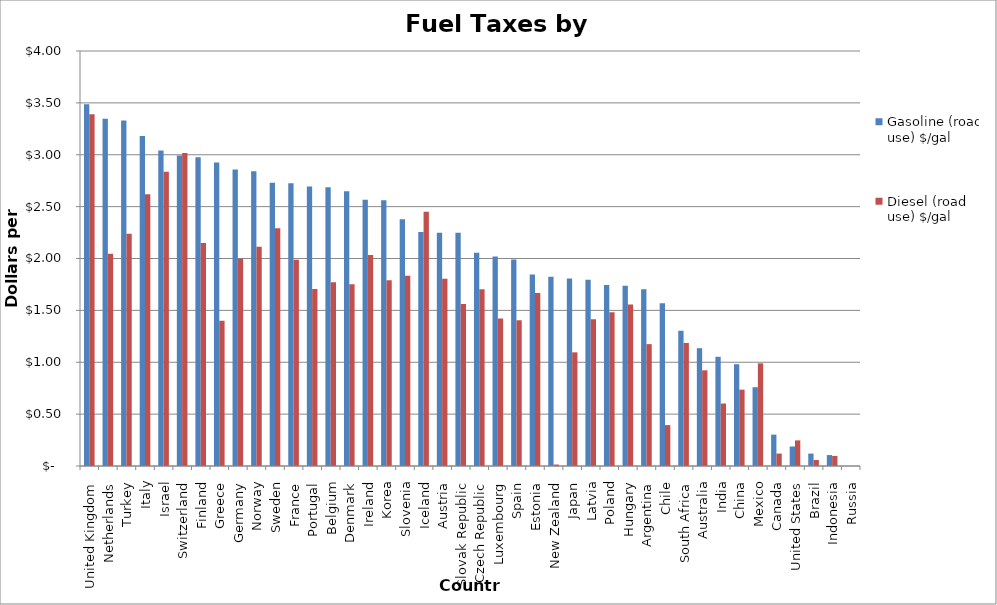
| Category | Gasoline (road use) $/gal | Diesel (road use) $/gal |
|---|---|---|
| United Kingdom | 3.487 | 3.389 |
| Netherlands | 3.346 | 2.047 |
| Turkey | 3.33 | 2.238 |
| Italy | 3.18 | 2.62 |
| Israel | 3.041 | 2.837 |
| Switzerland | 2.992 | 3.018 |
| Finland | 2.976 | 2.149 |
| Greece | 2.926 | 1.401 |
| Germany | 2.859 | 1.997 |
| Norway | 2.842 | 2.112 |
| Sweden | 2.731 | 2.292 |
| France | 2.726 | 1.988 |
| Portugal | 2.695 | 1.707 |
| Belgium | 2.687 | 1.772 |
| Denmark | 2.649 | 1.752 |
| Ireland | 2.567 | 2.034 |
| Korea | 2.562 | 1.789 |
| Slovenia | 2.378 | 1.833 |
| Iceland | 2.255 | 2.452 |
| Austria | 2.249 | 1.804 |
| Slovak Republic | 2.247 | 1.562 |
| Czech Republic | 2.056 | 1.704 |
| Luxembourg | 2.018 | 1.422 |
| Spain | 1.991 | 1.405 |
| Estonia | 1.846 | 1.668 |
| New Zealand | 1.823 | 0.014 |
| Japan | 1.808 | 1.096 |
| Latvia | 1.796 | 1.414 |
| Poland | 1.744 | 1.482 |
| Hungary | 1.738 | 1.556 |
| Argentina | 1.704 | 1.175 |
| Chile | 1.569 | 0.394 |
| South Africa | 1.305 | 1.186 |
| Australia | 1.135 | 0.922 |
| India | 1.053 | 0.602 |
| China | 0.981 | 0.736 |
| Mexico | 0.759 | 0.989 |
| Canada | 0.302 | 0.12 |
| United States | 0.188 | 0.247 |
| Brazil | 0.12 | 0.058 |
| Indonesia | 0.105 | 0.097 |
| Russia | 0 | 0 |